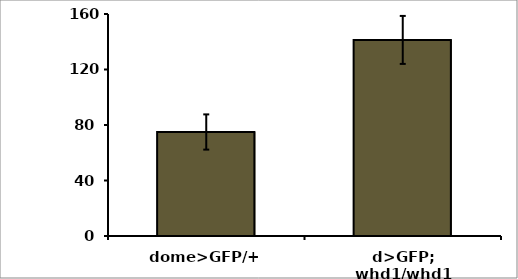
| Category | Series 0 |
|---|---|
| dome>GFP/+ | 74.953 |
| d>GFP; whd1/whd1 | 141.324 |